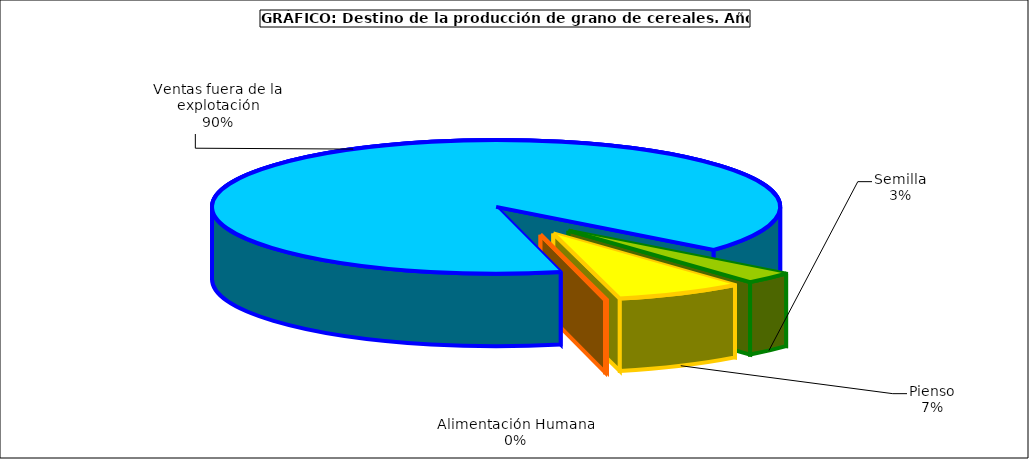
| Category | Series 0 |
|---|---|
| 0 | 567710 |
| 1 | 1452275 |
| 2 | 22073 |
| 3 | 17900087 |